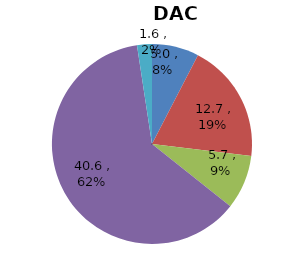
| Category | DAC  |
|---|---|
| Public sector | 4.986 |
| NGOs | 12.678 |
| International Red Cross and Red Crescent Movement  | 5.74 |
| Multilateral organisations | 40.624 |
| Other | 1.575 |